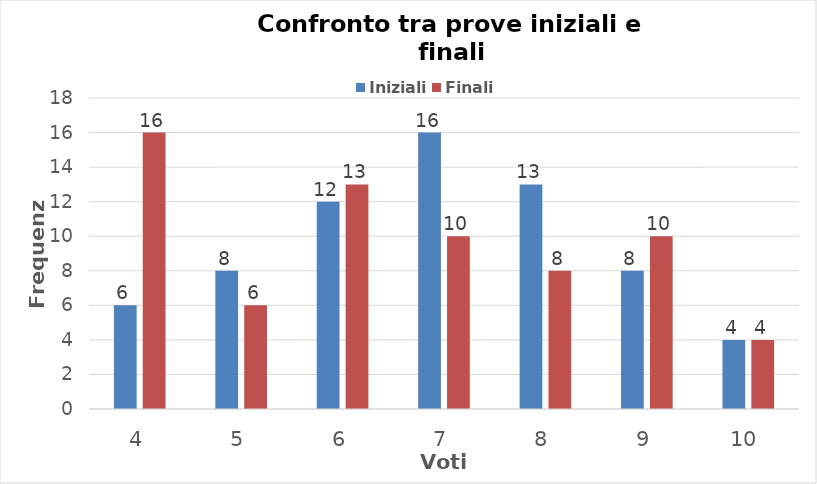
| Category | Iniziali | Finali |
|---|---|---|
| 4.0 | 6 | 16 |
| 5.0 | 8 | 6 |
| 6.0 | 12 | 13 |
| 7.0 | 16 | 10 |
| 8.0 | 13 | 8 |
| 9.0 | 8 | 10 |
| 10.0 | 4 | 4 |